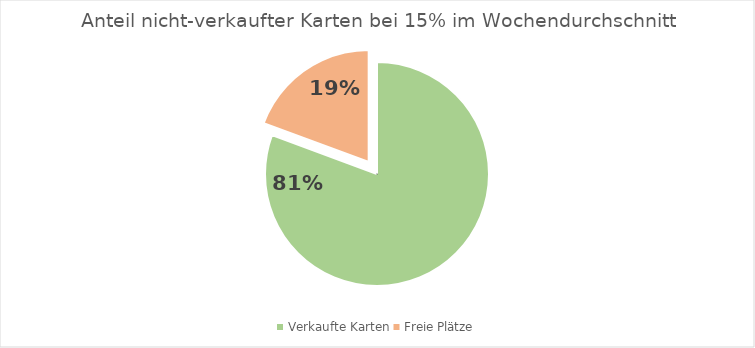
| Category | Series 0 |
|---|---|
| Verkaufte Karten | 12136 |
| Freie Plätze | 2914 |